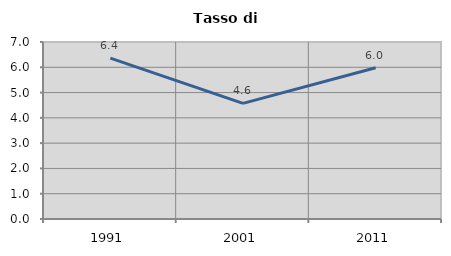
| Category | Tasso di disoccupazione   |
|---|---|
| 1991.0 | 6.363 |
| 2001.0 | 4.572 |
| 2011.0 | 5.983 |